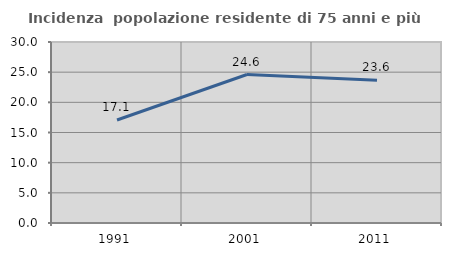
| Category | Incidenza  popolazione residente di 75 anni e più |
|---|---|
| 1991.0 | 17.073 |
| 2001.0 | 24.611 |
| 2011.0 | 23.649 |